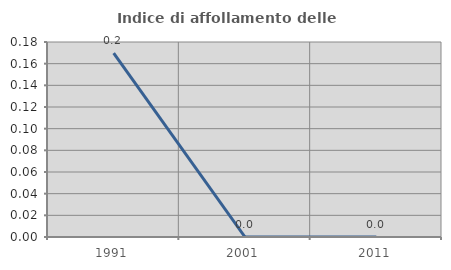
| Category | Indice di affollamento delle abitazioni  |
|---|---|
| 1991.0 | 0.17 |
| 2001.0 | 0 |
| 2011.0 | 0 |